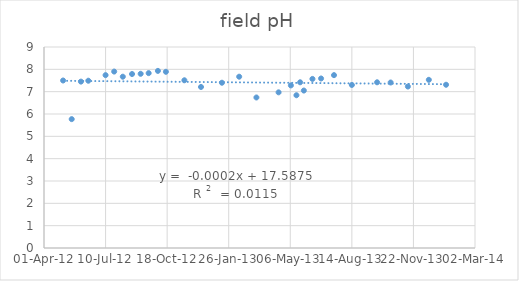
| Category | Series 0 |
|---|---|
| 41031.0 | 7.5 |
| 41045.0 | 5.77 |
| 41060.0 | 7.45 |
| 41072.0 | 7.49 |
| 41100.0 | 7.74 |
| 41114.0 | 7.9 |
| 41128.0 | 7.67 |
| 41143.0 | 7.79 |
| 41157.0 | 7.8 |
| 41170.0 | 7.83 |
| 41185.0 | 7.93 |
| 41198.0 | 7.89 |
| 41228.0 | 7.51 |
| 41255.0 | 7.21 |
| 41289.0 | 7.4 |
| 41317.0 | 7.67 |
| 41345.0 | 6.74 |
| 41381.0 | 6.97 |
| 41401.0 | 7.28 |
| 41410.0 | 6.84 |
| 41416.0 | 7.42 |
| 41422.0 | 7.05 |
| 41436.0 | 7.57 |
| 41450.0 | 7.59 |
| 41471.0 | 7.74 |
| 41500.0 | 7.3 |
| 41541.0 | 7.42 |
| 41563.0 | 7.41 |
| 41591.0 | 7.23 |
| 41625.0 | 7.53 |
| 41653.0 | 7.31 |